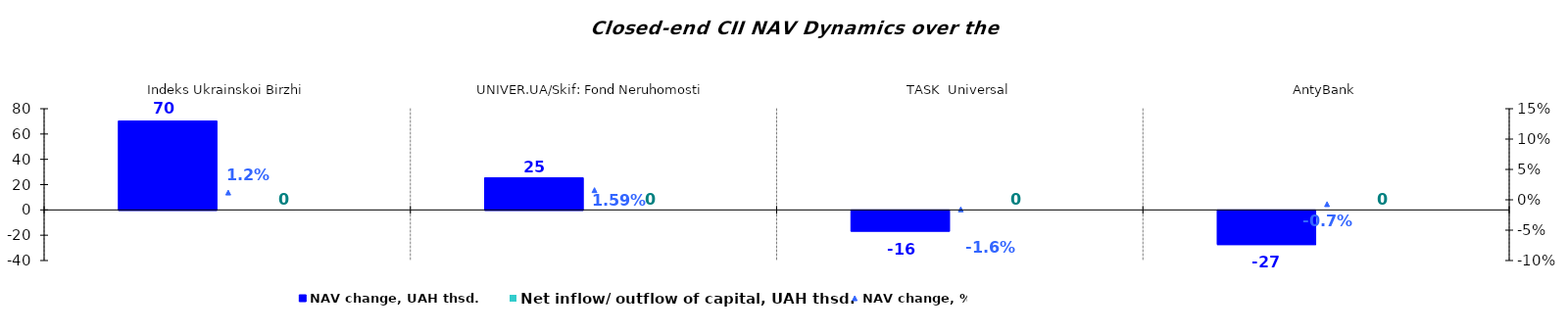
| Category | NAV change, UAH thsd. | Net inflow/ outflow of capital, UAH thsd. |
|---|---|---|
| Indeks Ukrainskoi Birzhi | 70.314 | 0 |
| UNIVER.UA/Skif: Fond Neruhomosti | 25.465 | 0 |
| TASK  Universal | -16.454 | 0 |
| AntyBank | -26.996 | 0 |